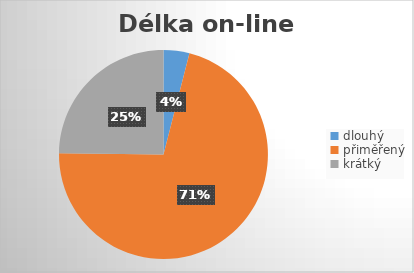
| Category | Series 0 |
|---|---|
| dlouhý | 5 |
| přiměřený | 89 |
| krátký | 31 |